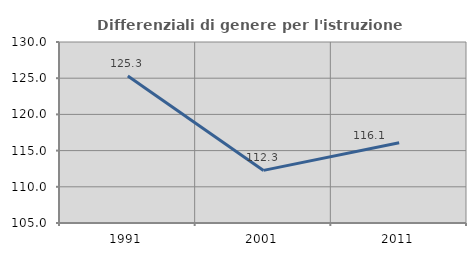
| Category | Differenziali di genere per l'istruzione superiore |
|---|---|
| 1991.0 | 125.315 |
| 2001.0 | 112.266 |
| 2011.0 | 116.079 |